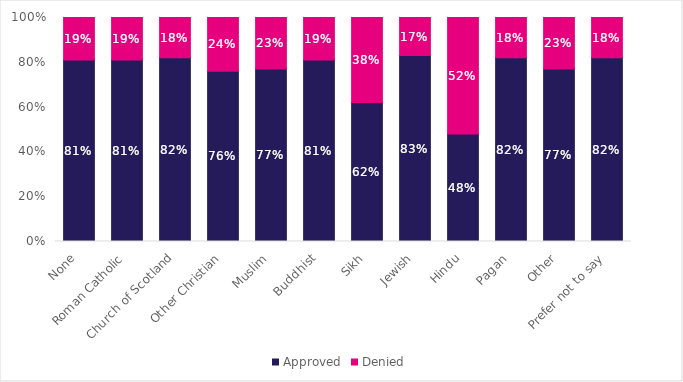
| Category | Approved | Denied |
|---|---|---|
| None | 0.81 | 0.19 |
| Roman Catholic | 0.81 | 0.19 |
| Church of Scotland | 0.82 | 0.18 |
| Other Christian | 0.76 | 0.24 |
| Muslim | 0.77 | 0.23 |
| Buddhist | 0.81 | 0.19 |
| Sikh | 0.62 | 0.38 |
| Jewish | 0.83 | 0.17 |
| Hindu | 0.48 | 0.52 |
| Pagan | 0.82 | 0.18 |
| Other | 0.77 | 0.23 |
| Prefer not to say | 0.82 | 0.18 |